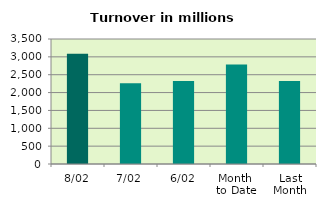
| Category | Series 0 |
|---|---|
| 8/02 | 3089.956 |
| 7/02 | 2263.408 |
| 6/02 | 2323.381 |
| Month 
to Date | 2782.866 |
| Last
Month | 2326.675 |